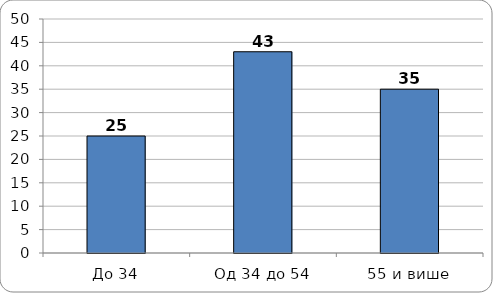
| Category | Series 0 |
|---|---|
| Дo 34 | 25 |
| Oд 34 дo 54 | 43 |
| 55 и више | 35 |